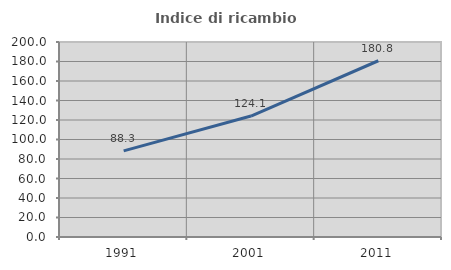
| Category | Indice di ricambio occupazionale  |
|---|---|
| 1991.0 | 88.321 |
| 2001.0 | 124.088 |
| 2011.0 | 180.769 |